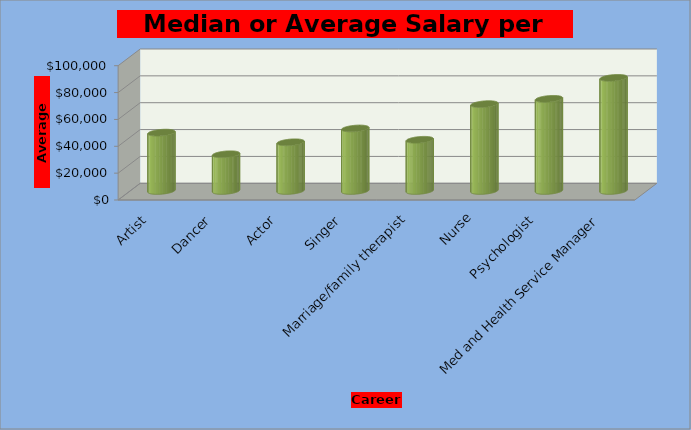
| Category | Median or Average Salary per Career Average Salary |
|---|---|
| Artist | 43472 |
| Dancer | 27372 |
| Actor | 36275 |
| Singer | 46571 |
| Marriage/family therapist | 38150 |
| Nurse | 64690 |
| Psychologist | 68640 |
| Med and Health Service Manager | 84270 |